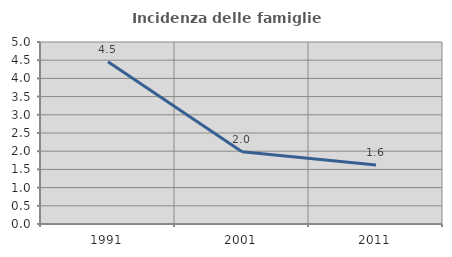
| Category | Incidenza delle famiglie numerose |
|---|---|
| 1991.0 | 4.459 |
| 2001.0 | 1.986 |
| 2011.0 | 1.618 |